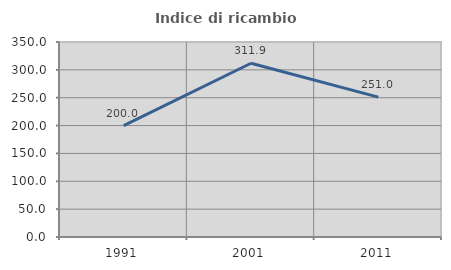
| Category | Indice di ricambio occupazionale  |
|---|---|
| 1991.0 | 200 |
| 2001.0 | 311.905 |
| 2011.0 | 251.02 |